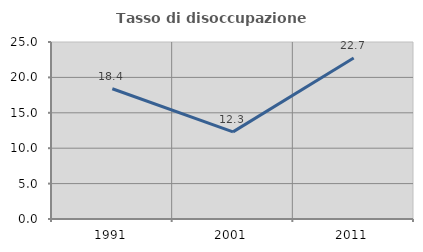
| Category | Tasso di disoccupazione giovanile  |
|---|---|
| 1991.0 | 18.4 |
| 2001.0 | 12.308 |
| 2011.0 | 22.727 |